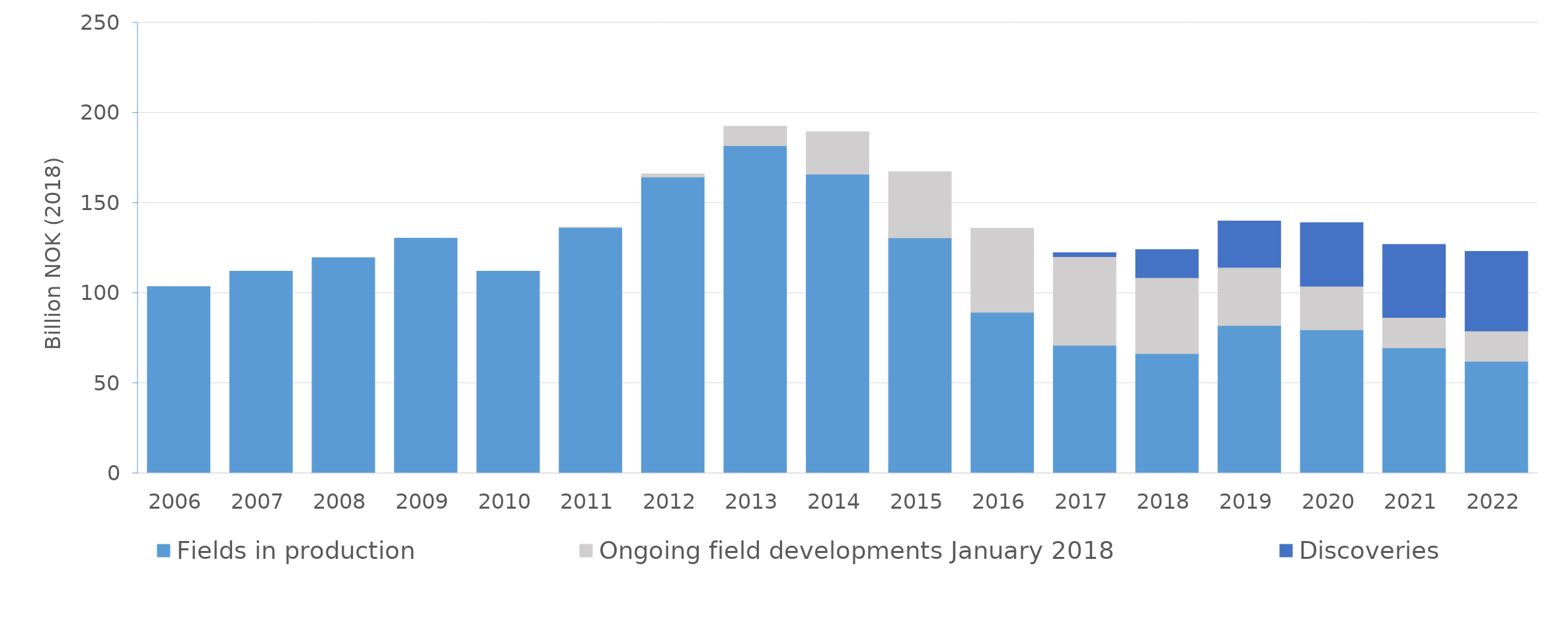
| Category | Fields in production | Ongoing field developments January 2018 | Discoveries |
|---|---|---|---|
| 2006.0 | 103.686 | 0 | 0 |
| 2007.0 | 112.216 | 0 | 0 |
| 2008.0 | 119.715 | 0 | 0 |
| 2009.0 | 130.506 | 0 | 0 |
| 2010.0 | 112.198 | 0 | 0 |
| 2011.0 | 136.392 | 0.236 | 0 |
| 2012.0 | 164.445 | 1.665 | 0 |
| 2013.0 | 181.815 | 10.851 | 0 |
| 2014.0 | 165.976 | 23.507 | 0 |
| 2015.0 | 130.657 | 36.725 | 0 |
| 2016.0 | 89.327 | 46.663 | 0 |
| 2017.0 | 70.998 | 49.21 | 2.184 |
| 2018.0 | 66.45 | 42.103 | 15.58 |
| 2019.0 | 81.989 | 32.328 | 25.751 |
| 2020.0 | 79.615 | 24.208 | 35.254 |
| 2021.0 | 69.634 | 16.889 | 40.533 |
| 2022.0 | 62.172 | 16.821 | 44.166 |